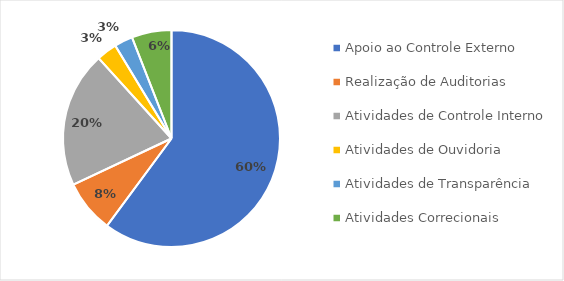
| Category | Series 0 |
|---|---|
| Apoio ao Controle Externo | 2288.657 |
| Realização de Auditorias | 299.567 |
| Atividades de Controle Interno | 771.331 |
| Atividades de Ouvidoria | 116.699 |
| Atividades de Transparência | 104.251 |
| Atividades Correcionais | 225.596 |